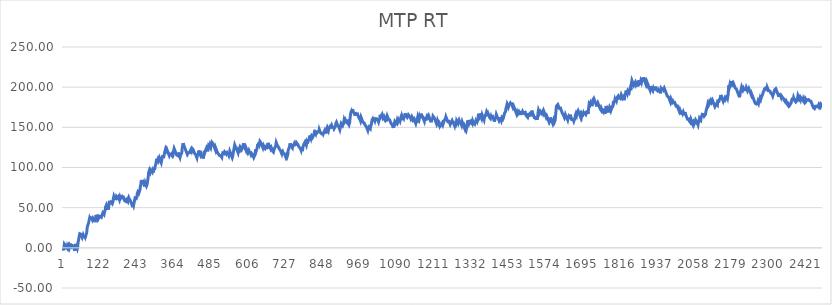
| Category | MTP RT |
|---|---|
| 0 | -1 |
| 1 | -2 |
| 2 | -3 |
| 3 | 0.92 |
| 4 | 4.74 |
| 5 | 5.69 |
| 6 | 4.69 |
| 7 | 3.69 |
| 8 | 2.69 |
| 9 | 1.69 |
| 10 | 0.69 |
| 11 | -0.31 |
| 12 | 0.31 |
| 13 | -0.69 |
| 14 | 1.71 |
| 15 | 0.71 |
| 16 | -0.29 |
| 17 | -1.29 |
| 18 | 2.24 |
| 19 | 1.24 |
| 20 | 0.24 |
| 21 | -0.76 |
| 22 | 3.65 |
| 23 | 2.65 |
| 24 | 3.55 |
| 25 | 2.55 |
| 26 | 1.55 |
| 27 | 0.55 |
| 28 | 3.29 |
| 29 | 2.29 |
| 30 | 4.3 |
| 31 | 3.3 |
| 32 | 2.3 |
| 33 | 1.3 |
| 34 | 0.3 |
| 35 | -0.7 |
| 36 | -1.7 |
| 37 | -2.7 |
| 38 | -3.7 |
| 39 | 0.12 |
| 40 | 4.92 |
| 41 | 3.92 |
| 42 | 2.92 |
| 43 | 1.92 |
| 44 | 0.92 |
| 45 | -0.08 |
| 46 | -1.08 |
| 47 | 0.636 |
| 48 | 5.046 |
| 49 | 7.786 |
| 50 | 9.316 |
| 51 | 11.866 |
| 52 | 10.866 |
| 53 | 15.766 |
| 54 | 17.566 |
| 55 | 16.566 |
| 56 | 17.496 |
| 57 | 17.906 |
| 58 | 16.906 |
| 59 | 15.906 |
| 60 | 14.906 |
| 61 | 13.906 |
| 62 | 12.906 |
| 63 | 14.006 |
| 64 | 13.006 |
| 65 | 16.146 |
| 66 | 15.146 |
| 67 | 14.146 |
| 68 | 13.146 |
| 69 | 12.146 |
| 70 | 15.186 |
| 71 | 14.186 |
| 72 | 13.186 |
| 73 | 12.186 |
| 74 | 15.616 |
| 75 | 14.616 |
| 76 | 15.436 |
| 77 | 19.846 |
| 78 | 24.456 |
| 79 | 26.516 |
| 80 | 25.516 |
| 81 | 27.626 |
| 82 | 26.626 |
| 83 | 31.526 |
| 84 | 30.526 |
| 85 | 31.436 |
| 86 | 36.726 |
| 87 | 35.726 |
| 88 | 34.726 |
| 89 | 37.666 |
| 90 | 38.546 |
| 91 | 37.546 |
| 92 | 36.546 |
| 93 | 37.116 |
| 94 | 36.116 |
| 95 | 35.116 |
| 96 | 34.116 |
| 97 | 37.256 |
| 98 | 37.976 |
| 99 | 36.976 |
| 100 | 35.976 |
| 101 | 34.976 |
| 102 | 33.976 |
| 103 | 32.976 |
| 104 | 31.976 |
| 105 | 35.306 |
| 106 | 36.136 |
| 107 | 41.036 |
| 108 | 40.036 |
| 109 | 39.036 |
| 110 | 38.036 |
| 111 | 37.036 |
| 112 | 36.036 |
| 113 | 35.036 |
| 114 | 34.036 |
| 115 | 36.586 |
| 116 | 39.626 |
| 117 | 38.626 |
| 118 | 39.156 |
| 119 | 40.056 |
| 120 | 39.056 |
| 121 | 38.056 |
| 122 | 39.976 |
| 123 | 38.976 |
| 124 | 37.976 |
| 125 | 38.876 |
| 126 | 40.596 |
| 127 | 41.086 |
| 128 | 41.596 |
| 129 | 43.536 |
| 130 | 42.536 |
| 131 | 43.476 |
| 132 | 42.476 |
| 133 | 41.476 |
| 134 | 42.026 |
| 135 | 45.356 |
| 136 | 44.356 |
| 137 | 47.196 |
| 138 | 50.826 |
| 139 | 51.946 |
| 140 | 50.946 |
| 141 | 53.596 |
| 142 | 52.596 |
| 143 | 51.596 |
| 144 | 50.596 |
| 145 | 49.596 |
| 146 | 48.596 |
| 147 | 47.596 |
| 148 | 50.246 |
| 149 | 53.186 |
| 150 | 56.516 |
| 151 | 57.376 |
| 152 | 56.376 |
| 153 | 55.376 |
| 154 | 55.956 |
| 155 | 58.796 |
| 156 | 57.796 |
| 157 | 56.796 |
| 158 | 57.116 |
| 159 | 56.116 |
| 160 | 55.116 |
| 161 | 54.116 |
| 162 | 57.346 |
| 163 | 60.486 |
| 164 | 59.486 |
| 165 | 64.186 |
| 166 | 63.186 |
| 167 | 62.186 |
| 168 | 62.566 |
| 169 | 61.566 |
| 170 | 62.276 |
| 171 | 61.276 |
| 172 | 60.276 |
| 173 | 63.996 |
| 174 | 64.296 |
| 175 | 63.296 |
| 176 | 62.296 |
| 177 | 62.656 |
| 178 | 61.656 |
| 179 | 63.716 |
| 180 | 62.716 |
| 181 | 61.716 |
| 182 | 60.716 |
| 183 | 59.716 |
| 184 | 58.716 |
| 185 | 63.226 |
| 186 | 62.226 |
| 187 | 61.226 |
| 188 | 60.226 |
| 189 | 62.426 |
| 190 | 61.426 |
| 191 | 63.386 |
| 192 | 62.386 |
| 193 | 61.386 |
| 194 | 64.616 |
| 195 | 63.616 |
| 196 | 62.616 |
| 197 | 61.616 |
| 198 | 60.616 |
| 199 | 59.616 |
| 200 | 58.616 |
| 201 | 57.616 |
| 202 | 59.726 |
| 203 | 58.726 |
| 204 | 57.726 |
| 205 | 56.726 |
| 206 | 59.766 |
| 207 | 60.656 |
| 208 | 59.656 |
| 209 | 58.656 |
| 210 | 57.656 |
| 211 | 60.886 |
| 212 | 61.716 |
| 213 | 62.756 |
| 214 | 61.756 |
| 215 | 60.756 |
| 216 | 59.756 |
| 217 | 60.256 |
| 218 | 59.256 |
| 219 | 58.256 |
| 220 | 57.256 |
| 221 | 56.256 |
| 222 | 55.256 |
| 223 | 54.256 |
| 224 | 53.256 |
| 225 | 52.256 |
| 226 | 54.266 |
| 227 | 54.656 |
| 228 | 53.656 |
| 229 | 52.656 |
| 230 | 51.656 |
| 231 | 56.756 |
| 232 | 58.616 |
| 233 | 57.616 |
| 234 | 62.126 |
| 235 | 61.126 |
| 236 | 61.586 |
| 237 | 62.426 |
| 238 | 61.426 |
| 239 | 60.426 |
| 240 | 63.466 |
| 241 | 67.676 |
| 242 | 66.676 |
| 243 | 69.616 |
| 244 | 69.856 |
| 245 | 68.856 |
| 246 | 67.856 |
| 247 | 66.856 |
| 248 | 67.816 |
| 249 | 66.816 |
| 250 | 72.496 |
| 251 | 75.826 |
| 252 | 76.706 |
| 253 | 79.596 |
| 254 | 83.806 |
| 255 | 82.806 |
| 256 | 81.806 |
| 257 | 84.456 |
| 258 | 83.456 |
| 259 | 82.456 |
| 260 | 81.456 |
| 261 | 80.456 |
| 262 | 79.456 |
| 263 | 78.456 |
| 264 | 77.456 |
| 265 | 76.456 |
| 266 | 78.956 |
| 267 | 81.016 |
| 268 | 80.016 |
| 269 | 79.016 |
| 270 | 78.016 |
| 271 | 77.016 |
| 272 | 76.016 |
| 273 | 79.056 |
| 274 | 81.256 |
| 275 | 83.996 |
| 276 | 86.646 |
| 277 | 89.096 |
| 278 | 93.796 |
| 279 | 94.506 |
| 280 | 93.506 |
| 281 | 97.136 |
| 282 | 96.136 |
| 283 | 95.136 |
| 284 | 97.296 |
| 285 | 97.936 |
| 286 | 96.936 |
| 287 | 95.936 |
| 288 | 94.936 |
| 289 | 95.226 |
| 290 | 94.226 |
| 291 | 95.876 |
| 292 | 94.876 |
| 293 | 93.876 |
| 294 | 94.286 |
| 295 | 98.896 |
| 296 | 97.896 |
| 297 | 96.896 |
| 298 | 99.736 |
| 299 | 98.736 |
| 300 | 102.456 |
| 301 | 101.456 |
| 302 | 105.476 |
| 303 | 104.476 |
| 304 | 110.746 |
| 305 | 109.746 |
| 306 | 108.746 |
| 307 | 107.746 |
| 308 | 110.536 |
| 309 | 109.536 |
| 310 | 108.536 |
| 311 | 107.536 |
| 312 | 108.486 |
| 313 | 112.116 |
| 314 | 111.116 |
| 315 | 110.116 |
| 316 | 109.116 |
| 317 | 108.116 |
| 318 | 107.116 |
| 319 | 106.116 |
| 320 | 106.576 |
| 321 | 110.296 |
| 322 | 111.316 |
| 323 | 113.616 |
| 324 | 112.616 |
| 325 | 113.676 |
| 326 | 112.676 |
| 327 | 113.316 |
| 328 | 112.316 |
| 329 | 116.436 |
| 330 | 118.736 |
| 331 | 118.906 |
| 332 | 117.906 |
| 333 | 123.006 |
| 334 | 122.006 |
| 335 | 121.006 |
| 336 | 120.006 |
| 337 | 122.896 |
| 338 | 121.896 |
| 339 | 120.896 |
| 340 | 119.896 |
| 341 | 118.896 |
| 342 | 117.896 |
| 343 | 116.896 |
| 344 | 115.896 |
| 345 | 114.896 |
| 346 | 113.896 |
| 347 | 116.936 |
| 348 | 115.936 |
| 349 | 116.606 |
| 350 | 117.286 |
| 351 | 116.286 |
| 352 | 115.286 |
| 353 | 115.856 |
| 354 | 114.856 |
| 355 | 113.856 |
| 356 | 119.736 |
| 357 | 118.736 |
| 358 | 117.736 |
| 359 | 120.136 |
| 360 | 119.136 |
| 361 | 123.646 |
| 362 | 122.646 |
| 363 | 121.646 |
| 364 | 120.646 |
| 365 | 119.646 |
| 366 | 118.646 |
| 367 | 117.646 |
| 368 | 116.646 |
| 369 | 115.646 |
| 370 | 114.646 |
| 371 | 116.806 |
| 372 | 115.806 |
| 373 | 114.806 |
| 374 | 118.526 |
| 375 | 117.526 |
| 376 | 116.526 |
| 377 | 115.526 |
| 378 | 114.526 |
| 379 | 113.526 |
| 380 | 112.526 |
| 381 | 114.366 |
| 382 | 113.366 |
| 383 | 115.866 |
| 384 | 116.366 |
| 385 | 115.366 |
| 386 | 118.596 |
| 387 | 123.496 |
| 388 | 122.496 |
| 389 | 127.396 |
| 390 | 130.186 |
| 391 | 129.186 |
| 392 | 128.186 |
| 393 | 127.186 |
| 394 | 126.186 |
| 395 | 125.186 |
| 396 | 124.186 |
| 397 | 123.186 |
| 398 | 122.186 |
| 399 | 121.186 |
| 400 | 120.186 |
| 401 | 119.186 |
| 402 | 118.186 |
| 403 | 117.186 |
| 404 | 116.186 |
| 405 | 116.586 |
| 406 | 115.586 |
| 407 | 118.236 |
| 408 | 118.486 |
| 409 | 119.176 |
| 410 | 118.176 |
| 411 | 119.016 |
| 412 | 118.016 |
| 413 | 117.016 |
| 414 | 121.136 |
| 415 | 120.136 |
| 416 | 122.686 |
| 417 | 121.686 |
| 418 | 120.686 |
| 419 | 119.686 |
| 420 | 123.506 |
| 421 | 124.056 |
| 422 | 123.056 |
| 423 | 122.056 |
| 424 | 121.056 |
| 425 | 120.056 |
| 426 | 119.056 |
| 427 | 118.056 |
| 428 | 117.056 |
| 429 | 118.016 |
| 430 | 117.016 |
| 431 | 116.016 |
| 432 | 115.016 |
| 433 | 114.016 |
| 434 | 113.016 |
| 435 | 112.016 |
| 436 | 114.126 |
| 437 | 116.816 |
| 438 | 115.816 |
| 439 | 114.816 |
| 440 | 118.636 |
| 441 | 121.086 |
| 442 | 120.086 |
| 443 | 119.086 |
| 444 | 118.086 |
| 445 | 117.086 |
| 446 | 116.086 |
| 447 | 115.086 |
| 448 | 114.086 |
| 449 | 116.876 |
| 450 | 115.876 |
| 451 | 114.876 |
| 452 | 115.276 |
| 453 | 114.276 |
| 454 | 113.276 |
| 455 | 112.276 |
| 456 | 111.276 |
| 457 | 114.506 |
| 458 | 117.196 |
| 459 | 120.826 |
| 460 | 119.826 |
| 461 | 118.826 |
| 462 | 119.636 |
| 463 | 118.636 |
| 464 | 122.066 |
| 465 | 121.066 |
| 466 | 124.106 |
| 467 | 123.106 |
| 468 | 122.106 |
| 469 | 121.106 |
| 470 | 120.106 |
| 471 | 123.636 |
| 472 | 122.636 |
| 473 | 127.436 |
| 474 | 128.296 |
| 475 | 127.296 |
| 476 | 126.296 |
| 477 | 125.296 |
| 478 | 127.496 |
| 479 | 126.496 |
| 480 | 125.496 |
| 481 | 127.896 |
| 482 | 126.896 |
| 483 | 129.396 |
| 484 | 131.406 |
| 485 | 132.056 |
| 486 | 131.056 |
| 487 | 130.056 |
| 488 | 129.056 |
| 489 | 128.056 |
| 490 | 127.056 |
| 491 | 126.056 |
| 492 | 125.056 |
| 493 | 124.056 |
| 494 | 123.056 |
| 495 | 122.056 |
| 496 | 124.456 |
| 497 | 123.456 |
| 498 | 122.456 |
| 499 | 121.456 |
| 500 | 120.456 |
| 501 | 119.456 |
| 502 | 118.456 |
| 503 | 118.876 |
| 504 | 117.876 |
| 505 | 116.876 |
| 506 | 117.796 |
| 507 | 116.796 |
| 508 | 115.796 |
| 509 | 114.796 |
| 510 | 113.796 |
| 511 | 114.296 |
| 512 | 115.266 |
| 513 | 114.266 |
| 514 | 113.266 |
| 515 | 113.576 |
| 516 | 112.576 |
| 517 | 115.266 |
| 518 | 116.406 |
| 519 | 118.126 |
| 520 | 117.126 |
| 521 | 119.286 |
| 522 | 118.286 |
| 523 | 117.286 |
| 524 | 116.286 |
| 525 | 119.426 |
| 526 | 118.426 |
| 527 | 119.426 |
| 528 | 118.426 |
| 529 | 117.426 |
| 530 | 120.566 |
| 531 | 119.566 |
| 532 | 118.566 |
| 533 | 117.566 |
| 534 | 116.566 |
| 535 | 119.016 |
| 536 | 118.016 |
| 537 | 117.016 |
| 538 | 116.016 |
| 539 | 115.016 |
| 540 | 114.016 |
| 541 | 117.936 |
| 542 | 120.186 |
| 543 | 119.186 |
| 544 | 118.186 |
| 545 | 117.186 |
| 546 | 116.186 |
| 547 | 115.186 |
| 548 | 114.186 |
| 549 | 113.186 |
| 550 | 112.186 |
| 551 | 112.706 |
| 552 | 114.816 |
| 553 | 118.046 |
| 554 | 117.046 |
| 555 | 121.656 |
| 556 | 124.206 |
| 557 | 123.206 |
| 558 | 128.106 |
| 559 | 127.106 |
| 560 | 126.106 |
| 561 | 125.106 |
| 562 | 124.106 |
| 563 | 123.106 |
| 564 | 123.476 |
| 565 | 122.476 |
| 566 | 121.476 |
| 567 | 120.476 |
| 568 | 119.476 |
| 569 | 118.476 |
| 570 | 120.586 |
| 571 | 119.586 |
| 572 | 118.586 |
| 573 | 122.606 |
| 574 | 121.606 |
| 575 | 124.056 |
| 576 | 125.916 |
| 577 | 126.556 |
| 578 | 125.556 |
| 579 | 124.556 |
| 580 | 123.556 |
| 581 | 122.556 |
| 582 | 121.556 |
| 583 | 124.006 |
| 584 | 123.006 |
| 585 | 125.696 |
| 586 | 130.106 |
| 587 | 129.106 |
| 588 | 128.106 |
| 589 | 127.106 |
| 590 | 126.106 |
| 591 | 125.106 |
| 592 | 124.106 |
| 593 | 123.106 |
| 594 | 122.106 |
| 595 | 124.306 |
| 596 | 123.306 |
| 597 | 122.306 |
| 598 | 121.306 |
| 599 | 120.306 |
| 600 | 119.306 |
| 601 | 118.306 |
| 602 | 118.786 |
| 603 | 117.786 |
| 604 | 121.216 |
| 605 | 120.216 |
| 606 | 119.216 |
| 607 | 118.216 |
| 608 | 118.876 |
| 609 | 117.876 |
| 610 | 116.876 |
| 611 | 115.876 |
| 612 | 116.726 |
| 613 | 117.696 |
| 614 | 118.436 |
| 615 | 117.436 |
| 616 | 116.436 |
| 617 | 115.436 |
| 618 | 114.436 |
| 619 | 113.436 |
| 620 | 112.436 |
| 621 | 112.676 |
| 622 | 113.196 |
| 623 | 113.546 |
| 624 | 115.896 |
| 625 | 119.126 |
| 626 | 122.556 |
| 627 | 121.556 |
| 628 | 120.556 |
| 629 | 119.556 |
| 630 | 122.886 |
| 631 | 121.886 |
| 632 | 126.296 |
| 633 | 129.236 |
| 634 | 128.236 |
| 635 | 127.236 |
| 636 | 130.866 |
| 637 | 129.866 |
| 638 | 128.866 |
| 639 | 127.866 |
| 640 | 132.566 |
| 641 | 133.366 |
| 642 | 132.366 |
| 643 | 131.366 |
| 644 | 130.366 |
| 645 | 129.366 |
| 646 | 128.366 |
| 647 | 127.366 |
| 648 | 126.366 |
| 649 | 125.366 |
| 650 | 124.366 |
| 651 | 123.366 |
| 652 | 126.796 |
| 653 | 125.796 |
| 654 | 124.796 |
| 655 | 125.466 |
| 656 | 124.466 |
| 657 | 123.466 |
| 658 | 122.466 |
| 659 | 124.966 |
| 660 | 123.966 |
| 661 | 122.966 |
| 662 | 125.466 |
| 663 | 124.466 |
| 664 | 123.466 |
| 665 | 126.796 |
| 666 | 130.616 |
| 667 | 129.616 |
| 668 | 128.616 |
| 669 | 127.616 |
| 670 | 128.066 |
| 671 | 127.066 |
| 672 | 126.066 |
| 673 | 125.066 |
| 674 | 124.066 |
| 675 | 123.066 |
| 676 | 122.066 |
| 677 | 124.756 |
| 678 | 123.756 |
| 679 | 122.756 |
| 680 | 121.756 |
| 681 | 120.756 |
| 682 | 121.286 |
| 683 | 120.286 |
| 684 | 119.286 |
| 685 | 119.916 |
| 686 | 122.216 |
| 687 | 121.216 |
| 688 | 124.356 |
| 689 | 123.356 |
| 690 | 125.556 |
| 691 | 126.346 |
| 692 | 126.726 |
| 693 | 131.136 |
| 694 | 130.136 |
| 695 | 129.136 |
| 696 | 128.136 |
| 697 | 127.136 |
| 698 | 128.116 |
| 699 | 127.116 |
| 700 | 126.116 |
| 701 | 125.116 |
| 702 | 124.116 |
| 703 | 123.116 |
| 704 | 122.116 |
| 705 | 123.086 |
| 706 | 122.086 |
| 707 | 121.086 |
| 708 | 120.086 |
| 709 | 119.086 |
| 710 | 118.086 |
| 711 | 117.086 |
| 712 | 118.656 |
| 713 | 117.656 |
| 714 | 119.906 |
| 715 | 118.906 |
| 716 | 117.906 |
| 717 | 118.376 |
| 718 | 117.376 |
| 719 | 117.896 |
| 720 | 116.896 |
| 721 | 115.896 |
| 722 | 114.896 |
| 723 | 113.896 |
| 724 | 112.896 |
| 725 | 111.896 |
| 726 | 114.836 |
| 727 | 113.836 |
| 728 | 112.836 |
| 729 | 111.836 |
| 730 | 115.066 |
| 731 | 117.516 |
| 732 | 121.536 |
| 733 | 120.536 |
| 734 | 123.476 |
| 735 | 122.476 |
| 736 | 122.826 |
| 737 | 127.236 |
| 738 | 130.076 |
| 739 | 129.076 |
| 740 | 128.076 |
| 741 | 127.076 |
| 742 | 126.076 |
| 743 | 126.596 |
| 744 | 125.596 |
| 745 | 124.596 |
| 746 | 128.716 |
| 747 | 127.716 |
| 748 | 126.716 |
| 749 | 125.716 |
| 750 | 126.916 |
| 751 | 129.166 |
| 752 | 128.166 |
| 753 | 130.906 |
| 754 | 131.816 |
| 755 | 130.816 |
| 756 | 129.816 |
| 757 | 128.816 |
| 758 | 127.816 |
| 759 | 126.816 |
| 760 | 130.346 |
| 761 | 131.276 |
| 762 | 130.276 |
| 763 | 129.276 |
| 764 | 128.276 |
| 765 | 127.276 |
| 766 | 126.276 |
| 767 | 125.276 |
| 768 | 125.866 |
| 769 | 124.866 |
| 770 | 125.366 |
| 771 | 124.366 |
| 772 | 123.366 |
| 773 | 122.366 |
| 774 | 121.366 |
| 775 | 123.376 |
| 776 | 122.376 |
| 777 | 124.576 |
| 778 | 123.576 |
| 779 | 122.576 |
| 780 | 125.516 |
| 781 | 125.886 |
| 782 | 124.886 |
| 783 | 129.006 |
| 784 | 130.026 |
| 785 | 130.316 |
| 786 | 131.096 |
| 787 | 131.806 |
| 788 | 130.806 |
| 789 | 129.806 |
| 790 | 128.806 |
| 791 | 127.806 |
| 792 | 126.806 |
| 793 | 131.706 |
| 794 | 130.706 |
| 795 | 129.706 |
| 796 | 133.726 |
| 797 | 132.726 |
| 798 | 133.646 |
| 799 | 132.646 |
| 800 | 134.526 |
| 801 | 135.586 |
| 802 | 139.796 |
| 803 | 138.796 |
| 804 | 137.796 |
| 805 | 136.796 |
| 806 | 135.796 |
| 807 | 134.796 |
| 808 | 139.006 |
| 809 | 139.186 |
| 810 | 138.186 |
| 811 | 137.186 |
| 812 | 136.186 |
| 813 | 138.536 |
| 814 | 137.536 |
| 815 | 140.576 |
| 816 | 139.576 |
| 817 | 143.696 |
| 818 | 144.506 |
| 819 | 143.506 |
| 820 | 142.506 |
| 821 | 141.506 |
| 822 | 144.396 |
| 823 | 144.616 |
| 824 | 145.276 |
| 825 | 144.276 |
| 826 | 143.276 |
| 827 | 142.276 |
| 828 | 144.676 |
| 829 | 145.006 |
| 830 | 144.006 |
| 831 | 144.496 |
| 832 | 145.136 |
| 833 | 147.386 |
| 834 | 146.386 |
| 835 | 145.386 |
| 836 | 144.386 |
| 837 | 143.386 |
| 838 | 142.386 |
| 839 | 144.346 |
| 840 | 143.346 |
| 841 | 142.346 |
| 842 | 141.346 |
| 843 | 140.346 |
| 844 | 143.776 |
| 845 | 142.776 |
| 846 | 141.776 |
| 847 | 142.566 |
| 848 | 141.566 |
| 849 | 144.796 |
| 850 | 143.796 |
| 851 | 146.346 |
| 852 | 145.346 |
| 853 | 144.346 |
| 854 | 143.346 |
| 855 | 142.346 |
| 856 | 145.386 |
| 857 | 148.226 |
| 858 | 147.226 |
| 859 | 150.066 |
| 860 | 149.066 |
| 861 | 148.066 |
| 862 | 147.066 |
| 863 | 146.066 |
| 864 | 147.906 |
| 865 | 146.906 |
| 866 | 149.106 |
| 867 | 148.106 |
| 868 | 150.556 |
| 869 | 149.556 |
| 870 | 148.556 |
| 871 | 151.156 |
| 872 | 152.056 |
| 873 | 152.826 |
| 874 | 151.826 |
| 875 | 150.826 |
| 876 | 151.736 |
| 877 | 150.736 |
| 878 | 151.076 |
| 879 | 150.076 |
| 880 | 149.076 |
| 881 | 148.076 |
| 882 | 147.076 |
| 883 | 147.706 |
| 884 | 150.106 |
| 885 | 149.106 |
| 886 | 151.706 |
| 887 | 154.936 |
| 888 | 153.936 |
| 889 | 156.486 |
| 890 | 155.486 |
| 891 | 154.486 |
| 892 | 153.486 |
| 893 | 152.486 |
| 894 | 152.976 |
| 895 | 151.976 |
| 896 | 150.976 |
| 897 | 149.976 |
| 898 | 148.976 |
| 899 | 147.976 |
| 900 | 146.976 |
| 901 | 145.976 |
| 902 | 146.896 |
| 903 | 152.386 |
| 904 | 151.386 |
| 905 | 150.386 |
| 906 | 153.816 |
| 907 | 154.116 |
| 908 | 153.116 |
| 909 | 152.116 |
| 910 | 151.116 |
| 911 | 153.276 |
| 912 | 155.526 |
| 913 | 157.386 |
| 914 | 159.586 |
| 915 | 158.586 |
| 916 | 157.586 |
| 917 | 156.586 |
| 918 | 159.236 |
| 919 | 158.236 |
| 920 | 157.236 |
| 921 | 156.236 |
| 922 | 156.976 |
| 923 | 155.976 |
| 924 | 159.506 |
| 925 | 158.506 |
| 926 | 157.506 |
| 927 | 156.506 |
| 928 | 155.506 |
| 929 | 154.506 |
| 930 | 153.506 |
| 931 | 154.256 |
| 932 | 156.096 |
| 933 | 160.896 |
| 934 | 163.936 |
| 935 | 166.336 |
| 936 | 168.836 |
| 937 | 167.836 |
| 938 | 170.486 |
| 939 | 169.486 |
| 940 | 168.486 |
| 941 | 172.406 |
| 942 | 171.406 |
| 943 | 170.406 |
| 944 | 169.406 |
| 945 | 168.406 |
| 946 | 168.596 |
| 947 | 167.596 |
| 948 | 166.596 |
| 949 | 165.596 |
| 950 | 164.596 |
| 951 | 168.716 |
| 952 | 167.716 |
| 953 | 166.716 |
| 954 | 165.716 |
| 955 | 164.716 |
| 956 | 167.856 |
| 957 | 166.856 |
| 958 | 165.856 |
| 959 | 164.856 |
| 960 | 163.856 |
| 961 | 162.856 |
| 962 | 161.856 |
| 963 | 162.096 |
| 964 | 161.096 |
| 965 | 160.096 |
| 966 | 159.096 |
| 967 | 158.096 |
| 968 | 160.256 |
| 969 | 162.456 |
| 970 | 161.456 |
| 971 | 160.456 |
| 972 | 159.456 |
| 973 | 158.456 |
| 974 | 157.456 |
| 975 | 156.456 |
| 976 | 155.456 |
| 977 | 157.516 |
| 978 | 156.516 |
| 979 | 155.516 |
| 980 | 154.516 |
| 981 | 153.516 |
| 982 | 152.516 |
| 983 | 152.906 |
| 984 | 151.906 |
| 985 | 150.906 |
| 986 | 151.056 |
| 987 | 150.056 |
| 988 | 149.056 |
| 989 | 148.056 |
| 990 | 147.056 |
| 991 | 146.056 |
| 992 | 146.386 |
| 993 | 149.276 |
| 994 | 150.376 |
| 995 | 150.636 |
| 996 | 151.576 |
| 997 | 150.576 |
| 998 | 149.576 |
| 999 | 148.576 |
| 1000 | 151.516 |
| 1001 | 150.516 |
| 1002 | 152.916 |
| 1003 | 151.916 |
| 1004 | 152.826 |
| 1005 | 159.486 |
| 1006 | 158.486 |
| 1007 | 160.736 |
| 1008 | 159.736 |
| 1009 | 158.736 |
| 1010 | 157.736 |
| 1011 | 156.736 |
| 1012 | 160.066 |
| 1013 | 159.066 |
| 1014 | 158.066 |
| 1015 | 157.066 |
| 1016 | 160.986 |
| 1017 | 159.986 |
| 1018 | 160.596 |
| 1019 | 161.636 |
| 1020 | 160.636 |
| 1021 | 161.616 |
| 1022 | 160.616 |
| 1023 | 159.616 |
| 1024 | 158.616 |
| 1025 | 157.616 |
| 1026 | 156.616 |
| 1027 | 155.616 |
| 1028 | 159.336 |
| 1029 | 158.336 |
| 1030 | 161.126 |
| 1031 | 165.536 |
| 1032 | 164.536 |
| 1033 | 163.536 |
| 1034 | 164.056 |
| 1035 | 163.056 |
| 1036 | 165.356 |
| 1037 | 164.356 |
| 1038 | 163.356 |
| 1039 | 165.046 |
| 1040 | 164.046 |
| 1041 | 163.046 |
| 1042 | 162.046 |
| 1043 | 161.046 |
| 1044 | 160.046 |
| 1045 | 160.356 |
| 1046 | 159.356 |
| 1047 | 161.316 |
| 1048 | 160.316 |
| 1049 | 159.316 |
| 1050 | 158.316 |
| 1051 | 157.316 |
| 1052 | 160.646 |
| 1053 | 161.266 |
| 1054 | 164.106 |
| 1055 | 163.106 |
| 1056 | 162.106 |
| 1057 | 161.106 |
| 1058 | 160.106 |
| 1059 | 159.106 |
| 1060 | 161.306 |
| 1061 | 160.306 |
| 1062 | 159.306 |
| 1063 | 158.306 |
| 1064 | 157.306 |
| 1065 | 156.306 |
| 1066 | 155.306 |
| 1067 | 154.306 |
| 1068 | 155.246 |
| 1069 | 154.246 |
| 1070 | 153.246 |
| 1071 | 152.246 |
| 1072 | 151.246 |
| 1073 | 150.246 |
| 1074 | 149.246 |
| 1075 | 153.066 |
| 1076 | 153.936 |
| 1077 | 152.936 |
| 1078 | 156.566 |
| 1079 | 155.566 |
| 1080 | 154.566 |
| 1081 | 153.566 |
| 1082 | 156.356 |
| 1083 | 155.356 |
| 1084 | 155.996 |
| 1085 | 154.996 |
| 1086 | 153.996 |
| 1087 | 158.896 |
| 1088 | 157.896 |
| 1089 | 156.896 |
| 1090 | 155.896 |
| 1091 | 159.036 |
| 1092 | 158.036 |
| 1093 | 157.036 |
| 1094 | 159.976 |
| 1095 | 158.976 |
| 1096 | 157.976 |
| 1097 | 156.976 |
| 1098 | 161.096 |
| 1099 | 160.096 |
| 1100 | 159.096 |
| 1101 | 161.886 |
| 1102 | 164.186 |
| 1103 | 163.186 |
| 1104 | 162.186 |
| 1105 | 162.776 |
| 1106 | 161.776 |
| 1107 | 160.776 |
| 1108 | 163.816 |
| 1109 | 162.816 |
| 1110 | 161.816 |
| 1111 | 164.316 |
| 1112 | 167.456 |
| 1113 | 166.456 |
| 1114 | 165.456 |
| 1115 | 164.456 |
| 1116 | 163.456 |
| 1117 | 164.196 |
| 1118 | 163.196 |
| 1119 | 162.196 |
| 1120 | 161.196 |
| 1121 | 163.446 |
| 1122 | 162.446 |
| 1123 | 165.486 |
| 1124 | 164.486 |
| 1125 | 164.936 |
| 1126 | 163.936 |
| 1127 | 162.936 |
| 1128 | 163.496 |
| 1129 | 162.496 |
| 1130 | 161.496 |
| 1131 | 160.496 |
| 1132 | 159.496 |
| 1133 | 160.146 |
| 1134 | 163.086 |
| 1135 | 162.086 |
| 1136 | 161.086 |
| 1137 | 160.086 |
| 1138 | 159.086 |
| 1139 | 159.546 |
| 1140 | 158.546 |
| 1141 | 160.706 |
| 1142 | 159.706 |
| 1143 | 158.706 |
| 1144 | 157.706 |
| 1145 | 156.706 |
| 1146 | 155.706 |
| 1147 | 154.706 |
| 1148 | 153.706 |
| 1149 | 157.626 |
| 1150 | 156.626 |
| 1151 | 155.626 |
| 1152 | 158.856 |
| 1153 | 162.086 |
| 1154 | 164.006 |
| 1155 | 163.006 |
| 1156 | 162.006 |
| 1157 | 161.006 |
| 1158 | 160.006 |
| 1159 | 159.006 |
| 1160 | 163.516 |
| 1161 | 162.516 |
| 1162 | 161.516 |
| 1163 | 164.306 |
| 1164 | 166.906 |
| 1165 | 165.906 |
| 1166 | 164.906 |
| 1167 | 165.416 |
| 1168 | 164.416 |
| 1169 | 163.416 |
| 1170 | 162.416 |
| 1171 | 161.416 |
| 1172 | 160.416 |
| 1173 | 159.416 |
| 1174 | 158.416 |
| 1175 | 157.416 |
| 1176 | 158.266 |
| 1177 | 161.006 |
| 1178 | 160.006 |
| 1179 | 160.816 |
| 1180 | 161.256 |
| 1181 | 160.256 |
| 1182 | 162.116 |
| 1183 | 161.116 |
| 1184 | 164.156 |
| 1185 | 164.406 |
| 1186 | 163.406 |
| 1187 | 162.406 |
| 1188 | 161.406 |
| 1189 | 164.346 |
| 1190 | 163.346 |
| 1191 | 162.346 |
| 1192 | 161.346 |
| 1193 | 160.346 |
| 1194 | 159.346 |
| 1195 | 158.346 |
| 1196 | 157.346 |
| 1197 | 156.346 |
| 1198 | 160.166 |
| 1199 | 160.366 |
| 1200 | 159.366 |
| 1201 | 160.366 |
| 1202 | 160.966 |
| 1203 | 163.906 |
| 1204 | 162.906 |
| 1205 | 163.796 |
| 1206 | 162.796 |
| 1207 | 161.796 |
| 1208 | 160.796 |
| 1209 | 159.796 |
| 1210 | 158.796 |
| 1211 | 157.796 |
| 1212 | 156.796 |
| 1213 | 155.796 |
| 1214 | 154.796 |
| 1215 | 153.796 |
| 1216 | 152.796 |
| 1217 | 155.836 |
| 1218 | 158.236 |
| 1219 | 157.236 |
| 1220 | 156.236 |
| 1221 | 155.236 |
| 1222 | 154.236 |
| 1223 | 153.236 |
| 1224 | 152.236 |
| 1225 | 153.726 |
| 1226 | 152.726 |
| 1227 | 151.726 |
| 1228 | 150.726 |
| 1229 | 151.766 |
| 1230 | 150.766 |
| 1231 | 153.506 |
| 1232 | 152.506 |
| 1233 | 155.106 |
| 1234 | 154.106 |
| 1235 | 153.106 |
| 1236 | 154.333 |
| 1237 | 153.333 |
| 1238 | 156.863 |
| 1239 | 155.863 |
| 1240 | 158.903 |
| 1241 | 159.123 |
| 1242 | 159.363 |
| 1243 | 158.363 |
| 1244 | 161.303 |
| 1245 | 163.083 |
| 1246 | 162.083 |
| 1247 | 161.083 |
| 1248 | 160.083 |
| 1249 | 159.083 |
| 1250 | 158.083 |
| 1251 | 157.083 |
| 1252 | 156.083 |
| 1253 | 158.193 |
| 1254 | 157.193 |
| 1255 | 157.463 |
| 1256 | 156.463 |
| 1257 | 155.463 |
| 1258 | 154.463 |
| 1259 | 153.463 |
| 1260 | 152.463 |
| 1261 | 153.283 |
| 1262 | 155.833 |
| 1263 | 154.833 |
| 1264 | 155.603 |
| 1265 | 158.343 |
| 1266 | 157.343 |
| 1267 | 156.343 |
| 1268 | 155.343 |
| 1269 | 156.103 |
| 1270 | 155.103 |
| 1271 | 154.103 |
| 1272 | 153.103 |
| 1273 | 152.103 |
| 1274 | 154.353 |
| 1275 | 153.353 |
| 1276 | 153.923 |
| 1277 | 152.923 |
| 1278 | 151.923 |
| 1279 | 155.553 |
| 1280 | 158.883 |
| 1281 | 159.243 |
| 1282 | 158.243 |
| 1283 | 157.243 |
| 1284 | 156.243 |
| 1285 | 155.243 |
| 1286 | 156.133 |
| 1287 | 155.133 |
| 1288 | 158.763 |
| 1289 | 157.763 |
| 1290 | 156.763 |
| 1291 | 157.723 |
| 1292 | 156.723 |
| 1293 | 155.723 |
| 1294 | 154.723 |
| 1295 | 153.723 |
| 1296 | 152.723 |
| 1297 | 153.493 |
| 1298 | 156.723 |
| 1299 | 155.723 |
| 1300 | 154.723 |
| 1301 | 153.723 |
| 1302 | 152.723 |
| 1303 | 151.723 |
| 1304 | 150.723 |
| 1305 | 149.723 |
| 1306 | 148.723 |
| 1307 | 150.733 |
| 1308 | 149.733 |
| 1309 | 148.733 |
| 1310 | 147.733 |
| 1311 | 146.733 |
| 1312 | 148.473 |
| 1313 | 147.473 |
| 1314 | 150.613 |
| 1315 | 154.733 |
| 1316 | 158.653 |
| 1317 | 157.653 |
| 1318 | 156.653 |
| 1319 | 155.653 |
| 1320 | 154.653 |
| 1321 | 153.653 |
| 1322 | 156.693 |
| 1323 | 155.693 |
| 1324 | 157.513 |
| 1325 | 156.513 |
| 1326 | 155.513 |
| 1327 | 159.723 |
| 1328 | 158.723 |
| 1329 | 157.723 |
| 1330 | 156.723 |
| 1331 | 155.723 |
| 1332 | 157.973 |
| 1333 | 156.973 |
| 1334 | 155.973 |
| 1335 | 156.693 |
| 1336 | 155.693 |
| 1337 | 154.693 |
| 1338 | 158.023 |
| 1339 | 157.023 |
| 1340 | 156.023 |
| 1341 | 155.023 |
| 1342 | 158.163 |
| 1343 | 157.163 |
| 1344 | 156.163 |
| 1345 | 159.203 |
| 1346 | 158.203 |
| 1347 | 157.203 |
| 1348 | 156.203 |
| 1349 | 159.343 |
| 1350 | 163.263 |
| 1351 | 163.983 |
| 1352 | 162.983 |
| 1353 | 161.983 |
| 1354 | 164.093 |
| 1355 | 167.233 |
| 1356 | 166.233 |
| 1357 | 165.233 |
| 1358 | 164.233 |
| 1359 | 163.233 |
| 1360 | 162.233 |
| 1361 | 161.233 |
| 1362 | 160.233 |
| 1363 | 165.523 |
| 1364 | 164.523 |
| 1365 | 163.523 |
| 1366 | 162.523 |
| 1367 | 161.523 |
| 1368 | 160.523 |
| 1369 | 159.523 |
| 1370 | 161.923 |
| 1371 | 160.923 |
| 1372 | 161.503 |
| 1373 | 164.643 |
| 1374 | 163.643 |
| 1375 | 165.993 |
| 1376 | 164.993 |
| 1377 | 169.013 |
| 1378 | 168.013 |
| 1379 | 167.013 |
| 1380 | 166.013 |
| 1381 | 168.313 |
| 1382 | 167.313 |
| 1383 | 166.313 |
| 1384 | 165.313 |
| 1385 | 164.313 |
| 1386 | 163.313 |
| 1387 | 162.313 |
| 1388 | 161.313 |
| 1389 | 161.903 |
| 1390 | 160.903 |
| 1391 | 159.903 |
| 1392 | 163.623 |
| 1393 | 162.623 |
| 1394 | 161.623 |
| 1395 | 165.153 |
| 1396 | 164.153 |
| 1397 | 163.153 |
| 1398 | 162.153 |
| 1399 | 161.153 |
| 1400 | 160.153 |
| 1401 | 159.153 |
| 1402 | 158.153 |
| 1403 | 157.153 |
| 1404 | 160.193 |
| 1405 | 159.193 |
| 1406 | 161.933 |
| 1407 | 160.933 |
| 1408 | 163.673 |
| 1409 | 165.873 |
| 1410 | 164.873 |
| 1411 | 163.873 |
| 1412 | 162.873 |
| 1413 | 161.873 |
| 1414 | 162.233 |
| 1415 | 161.233 |
| 1416 | 160.233 |
| 1417 | 159.233 |
| 1418 | 158.233 |
| 1419 | 157.233 |
| 1420 | 159.833 |
| 1421 | 162.433 |
| 1422 | 161.433 |
| 1423 | 160.433 |
| 1424 | 159.433 |
| 1425 | 158.433 |
| 1426 | 159.193 |
| 1427 | 161.793 |
| 1428 | 160.793 |
| 1429 | 161.053 |
| 1430 | 160.053 |
| 1431 | 159.053 |
| 1432 | 161.793 |
| 1433 | 163.463 |
| 1434 | 165.243 |
| 1435 | 164.243 |
| 1436 | 167.873 |
| 1437 | 166.873 |
| 1438 | 167.413 |
| 1439 | 169.613 |
| 1440 | 173.143 |
| 1441 | 172.143 |
| 1442 | 175.673 |
| 1443 | 174.673 |
| 1444 | 178.883 |
| 1445 | 177.883 |
| 1446 | 176.883 |
| 1447 | 175.883 |
| 1448 | 174.883 |
| 1449 | 173.883 |
| 1450 | 175.803 |
| 1451 | 178.103 |
| 1452 | 177.103 |
| 1453 | 177.493 |
| 1454 | 179.893 |
| 1455 | 178.893 |
| 1456 | 177.893 |
| 1457 | 180.733 |
| 1458 | 179.733 |
| 1459 | 178.733 |
| 1460 | 177.733 |
| 1461 | 176.733 |
| 1462 | 175.733 |
| 1463 | 174.733 |
| 1464 | 173.733 |
| 1465 | 176.573 |
| 1466 | 175.573 |
| 1467 | 174.573 |
| 1468 | 173.573 |
| 1469 | 172.573 |
| 1470 | 171.573 |
| 1471 | 170.573 |
| 1472 | 169.573 |
| 1473 | 168.573 |
| 1474 | 167.573 |
| 1475 | 166.573 |
| 1476 | 165.573 |
| 1477 | 169.103 |
| 1478 | 168.103 |
| 1479 | 167.103 |
| 1480 | 167.353 |
| 1481 | 166.353 |
| 1482 | 169.293 |
| 1483 | 168.293 |
| 1484 | 167.293 |
| 1485 | 166.293 |
| 1486 | 165.293 |
| 1487 | 168.433 |
| 1488 | 167.433 |
| 1489 | 169.443 |
| 1490 | 168.443 |
| 1491 | 167.443 |
| 1492 | 167.703 |
| 1493 | 166.703 |
| 1494 | 169.743 |
| 1495 | 168.743 |
| 1496 | 167.743 |
| 1497 | 168.263 |
| 1498 | 167.263 |
| 1499 | 168.053 |
| 1500 | 167.053 |
| 1501 | 170.283 |
| 1502 | 169.283 |
| 1503 | 168.283 |
| 1504 | 167.283 |
| 1505 | 166.283 |
| 1506 | 165.283 |
| 1507 | 164.283 |
| 1508 | 163.283 |
| 1509 | 164.392 |
| 1510 | 163.392 |
| 1511 | 162.392 |
| 1512 | 161.392 |
| 1513 | 164.822 |
| 1514 | 167.562 |
| 1515 | 166.562 |
| 1516 | 165.562 |
| 1517 | 164.562 |
| 1518 | 163.562 |
| 1519 | 166.792 |
| 1520 | 165.792 |
| 1521 | 167.902 |
| 1522 | 166.902 |
| 1523 | 165.902 |
| 1524 | 170.802 |
| 1525 | 169.802 |
| 1526 | 168.802 |
| 1527 | 167.802 |
| 1528 | 166.802 |
| 1529 | 165.802 |
| 1530 | 164.802 |
| 1531 | 163.802 |
| 1532 | 162.802 |
| 1533 | 161.802 |
| 1534 | 160.802 |
| 1535 | 163.252 |
| 1536 | 162.252 |
| 1537 | 161.252 |
| 1538 | 160.252 |
| 1539 | 159.252 |
| 1540 | 161.752 |
| 1541 | 160.752 |
| 1542 | 159.752 |
| 1543 | 162.592 |
| 1544 | 165.922 |
| 1545 | 169.152 |
| 1546 | 171.452 |
| 1547 | 170.452 |
| 1548 | 169.452 |
| 1549 | 168.452 |
| 1550 | 167.452 |
| 1551 | 166.452 |
| 1552 | 169.052 |
| 1553 | 168.052 |
| 1554 | 167.052 |
| 1555 | 170.092 |
| 1556 | 169.092 |
| 1557 | 168.092 |
| 1558 | 167.092 |
| 1559 | 169.492 |
| 1560 | 168.492 |
| 1561 | 167.492 |
| 1562 | 166.492 |
| 1563 | 170.412 |
| 1564 | 169.412 |
| 1565 | 168.412 |
| 1566 | 167.412 |
| 1567 | 166.412 |
| 1568 | 165.412 |
| 1569 | 164.412 |
| 1570 | 163.412 |
| 1571 | 162.412 |
| 1572 | 161.412 |
| 1573 | 164.102 |
| 1574 | 163.102 |
| 1575 | 162.102 |
| 1576 | 161.102 |
| 1577 | 160.102 |
| 1578 | 159.102 |
| 1579 | 158.102 |
| 1580 | 157.102 |
| 1581 | 156.102 |
| 1582 | 155.102 |
| 1583 | 155.622 |
| 1584 | 158.362 |
| 1585 | 162.182 |
| 1586 | 161.182 |
| 1587 | 160.182 |
| 1588 | 159.182 |
| 1589 | 158.182 |
| 1590 | 157.182 |
| 1591 | 156.182 |
| 1592 | 155.182 |
| 1593 | 154.182 |
| 1594 | 153.182 |
| 1595 | 156.322 |
| 1596 | 158.522 |
| 1597 | 157.522 |
| 1598 | 156.522 |
| 1599 | 155.522 |
| 1600 | 158.462 |
| 1601 | 161.892 |
| 1602 | 166.102 |
| 1603 | 170.712 |
| 1604 | 174.432 |
| 1605 | 176.682 |
| 1606 | 175.682 |
| 1607 | 176.472 |
| 1608 | 175.472 |
| 1609 | 178.362 |
| 1610 | 177.362 |
| 1611 | 176.362 |
| 1612 | 175.362 |
| 1613 | 174.362 |
| 1614 | 173.362 |
| 1615 | 172.362 |
| 1616 | 175.302 |
| 1617 | 174.302 |
| 1618 | 173.302 |
| 1619 | 172.302 |
| 1620 | 171.302 |
| 1621 | 170.302 |
| 1622 | 169.302 |
| 1623 | 168.302 |
| 1624 | 167.302 |
| 1625 | 166.302 |
| 1626 | 166.572 |
| 1627 | 165.572 |
| 1628 | 164.572 |
| 1629 | 163.572 |
| 1630 | 162.572 |
| 1631 | 161.572 |
| 1632 | 160.572 |
| 1633 | 162.972 |
| 1634 | 165.222 |
| 1635 | 164.222 |
| 1636 | 163.222 |
| 1637 | 163.332 |
| 1638 | 162.332 |
| 1639 | 161.332 |
| 1640 | 160.332 |
| 1641 | 159.332 |
| 1642 | 161.342 |
| 1643 | 161.752 |
| 1644 | 160.752 |
| 1645 | 164.182 |
| 1646 | 163.182 |
| 1647 | 163.682 |
| 1648 | 162.682 |
| 1649 | 165.622 |
| 1650 | 164.622 |
| 1651 | 163.622 |
| 1652 | 162.622 |
| 1653 | 161.622 |
| 1654 | 160.622 |
| 1655 | 159.622 |
| 1656 | 158.622 |
| 1657 | 160.292 |
| 1658 | 159.292 |
| 1659 | 159.562 |
| 1660 | 158.562 |
| 1661 | 157.562 |
| 1662 | 157.792 |
| 1663 | 156.792 |
| 1664 | 158.752 |
| 1665 | 161.982 |
| 1666 | 164.922 |
| 1667 | 163.922 |
| 1668 | 167.152 |
| 1669 | 166.152 |
| 1670 | 165.152 |
| 1671 | 167.352 |
| 1672 | 166.352 |
| 1673 | 168.512 |
| 1674 | 167.512 |
| 1675 | 170.652 |
| 1676 | 169.652 |
| 1677 | 168.652 |
| 1678 | 167.652 |
| 1679 | 166.652 |
| 1680 | 165.652 |
| 1681 | 164.652 |
| 1682 | 163.652 |
| 1683 | 162.652 |
| 1684 | 165.052 |
| 1685 | 164.052 |
| 1686 | 163.052 |
| 1687 | 165.212 |
| 1688 | 164.212 |
| 1689 | 163.212 |
| 1690 | 166.152 |
| 1691 | 165.152 |
| 1692 | 168.092 |
| 1693 | 167.092 |
| 1694 | 166.092 |
| 1695 | 169.322 |
| 1696 | 168.322 |
| 1697 | 167.322 |
| 1698 | 166.322 |
| 1699 | 166.852 |
| 1700 | 165.852 |
| 1701 | 164.852 |
| 1702 | 167.992 |
| 1703 | 170.782 |
| 1704 | 169.782 |
| 1705 | 168.782 |
| 1706 | 167.782 |
| 1707 | 166.782 |
| 1708 | 169.572 |
| 1709 | 173.292 |
| 1710 | 173.972 |
| 1711 | 179.462 |
| 1712 | 178.462 |
| 1713 | 178.872 |
| 1714 | 177.872 |
| 1715 | 176.872 |
| 1716 | 180.402 |
| 1717 | 179.402 |
| 1718 | 178.402 |
| 1719 | 177.402 |
| 1720 | 176.402 |
| 1721 | 180.032 |
| 1722 | 180.762 |
| 1723 | 184.192 |
| 1724 | 183.192 |
| 1725 | 183.632 |
| 1726 | 186.032 |
| 1727 | 185.032 |
| 1728 | 184.032 |
| 1729 | 183.032 |
| 1730 | 182.032 |
| 1731 | 181.032 |
| 1732 | 180.032 |
| 1733 | 179.032 |
| 1734 | 178.032 |
| 1735 | 177.032 |
| 1736 | 176.032 |
| 1737 | 178.972 |
| 1738 | 177.972 |
| 1739 | 180.662 |
| 1740 | 179.662 |
| 1741 | 178.662 |
| 1742 | 177.662 |
| 1743 | 176.662 |
| 1744 | 175.662 |
| 1745 | 174.662 |
| 1746 | 173.662 |
| 1747 | 172.662 |
| 1748 | 172.982 |
| 1749 | 171.982 |
| 1750 | 170.982 |
| 1751 | 172.992 |
| 1752 | 171.992 |
| 1753 | 170.992 |
| 1754 | 169.992 |
| 1755 | 170.462 |
| 1756 | 169.462 |
| 1757 | 173.092 |
| 1758 | 172.092 |
| 1759 | 171.092 |
| 1760 | 170.092 |
| 1761 | 169.092 |
| 1762 | 168.092 |
| 1763 | 167.092 |
| 1764 | 170.232 |
| 1765 | 173.272 |
| 1766 | 176.602 |
| 1767 | 175.602 |
| 1768 | 174.602 |
| 1769 | 173.602 |
| 1770 | 172.602 |
| 1771 | 171.602 |
| 1772 | 170.602 |
| 1773 | 169.602 |
| 1774 | 168.602 |
| 1775 | 171.542 |
| 1776 | 170.542 |
| 1777 | 174.562 |
| 1778 | 173.562 |
| 1779 | 172.562 |
| 1780 | 171.562 |
| 1781 | 170.562 |
| 1782 | 169.562 |
| 1783 | 172.992 |
| 1784 | 176.912 |
| 1785 | 175.912 |
| 1786 | 174.912 |
| 1787 | 173.912 |
| 1788 | 176.312 |
| 1789 | 179.102 |
| 1790 | 183.022 |
| 1791 | 182.022 |
| 1792 | 181.022 |
| 1793 | 180.022 |
| 1794 | 182.522 |
| 1795 | 184.722 |
| 1796 | 183.722 |
| 1797 | 182.722 |
| 1798 | 185.512 |
| 1799 | 184.512 |
| 1800 | 183.512 |
| 1801 | 182.512 |
| 1802 | 187.122 |
| 1803 | 186.122 |
| 1804 | 186.502 |
| 1805 | 188.852 |
| 1806 | 187.852 |
| 1807 | 186.852 |
| 1808 | 185.852 |
| 1809 | 184.852 |
| 1810 | 187.402 |
| 1811 | 189.902 |
| 1812 | 188.902 |
| 1813 | 187.902 |
| 1814 | 186.902 |
| 1815 | 190.532 |
| 1816 | 189.532 |
| 1817 | 188.532 |
| 1818 | 187.532 |
| 1819 | 186.532 |
| 1820 | 185.532 |
| 1821 | 187.832 |
| 1822 | 186.832 |
| 1823 | 185.832 |
| 1824 | 184.832 |
| 1825 | 183.832 |
| 1826 | 187.552 |
| 1827 | 189.432 |
| 1828 | 189.882 |
| 1829 | 188.882 |
| 1830 | 193.192 |
| 1831 | 195.742 |
| 1832 | 194.742 |
| 1833 | 193.742 |
| 1834 | 192.742 |
| 1835 | 191.742 |
| 1836 | 193.482 |
| 1837 | 195.542 |
| 1838 | 196.382 |
| 1839 | 195.382 |
| 1840 | 194.382 |
| 1841 | 193.382 |
| 1842 | 195.542 |
| 1843 | 194.542 |
| 1844 | 198.172 |
| 1845 | 197.172 |
| 1846 | 196.172 |
| 1847 | 199.112 |
| 1848 | 202.642 |
| 1849 | 205.872 |
| 1850 | 208.272 |
| 1851 | 207.272 |
| 1852 | 206.272 |
| 1853 | 205.272 |
| 1854 | 204.272 |
| 1855 | 203.272 |
| 1856 | 202.272 |
| 1857 | 201.272 |
| 1858 | 203.872 |
| 1859 | 202.872 |
| 1860 | 205.422 |
| 1861 | 204.422 |
| 1862 | 203.422 |
| 1863 | 204.892 |
| 1864 | 203.892 |
| 1865 | 202.892 |
| 1866 | 201.892 |
| 1867 | 200.892 |
| 1868 | 203.832 |
| 1869 | 202.832 |
| 1870 | 205.132 |
| 1871 | 208.362 |
| 1872 | 207.362 |
| 1873 | 206.362 |
| 1874 | 205.362 |
| 1875 | 204.362 |
| 1876 | 204.832 |
| 1877 | 203.832 |
| 1878 | 205.842 |
| 1879 | 207.742 |
| 1880 | 206.742 |
| 1881 | 205.742 |
| 1882 | 204.742 |
| 1883 | 209.052 |
| 1884 | 211.502 |
| 1885 | 210.502 |
| 1886 | 209.502 |
| 1887 | 211.952 |
| 1888 | 210.952 |
| 1889 | 209.952 |
| 1890 | 208.952 |
| 1891 | 207.952 |
| 1892 | 206.952 |
| 1893 | 205.952 |
| 1894 | 204.952 |
| 1895 | 203.952 |
| 1896 | 206.062 |
| 1897 | 205.062 |
| 1898 | 204.062 |
| 1899 | 206.362 |
| 1900 | 205.362 |
| 1901 | 204.362 |
| 1902 | 203.362 |
| 1903 | 202.362 |
| 1904 | 201.362 |
| 1905 | 200.362 |
| 1906 | 199.362 |
| 1907 | 198.362 |
| 1908 | 197.362 |
| 1909 | 196.362 |
| 1910 | 198.422 |
| 1911 | 201.212 |
| 1912 | 200.212 |
| 1913 | 199.212 |
| 1914 | 198.212 |
| 1915 | 197.212 |
| 1916 | 196.212 |
| 1917 | 196.432 |
| 1918 | 195.432 |
| 1919 | 194.432 |
| 1920 | 198.352 |
| 1921 | 197.352 |
| 1922 | 196.352 |
| 1923 | 199.982 |
| 1924 | 198.982 |
| 1925 | 197.982 |
| 1926 | 200.532 |
| 1927 | 199.532 |
| 1928 | 198.532 |
| 1929 | 197.532 |
| 1930 | 196.532 |
| 1931 | 195.532 |
| 1932 | 197.692 |
| 1933 | 196.692 |
| 1934 | 195.692 |
| 1935 | 194.692 |
| 1936 | 193.692 |
| 1937 | 196.632 |
| 1938 | 197.452 |
| 1939 | 196.452 |
| 1940 | 195.452 |
| 1941 | 194.452 |
| 1942 | 193.452 |
| 1943 | 192.452 |
| 1944 | 195.052 |
| 1945 | 198.772 |
| 1946 | 197.772 |
| 1947 | 198.402 |
| 1948 | 197.402 |
| 1949 | 196.402 |
| 1950 | 195.402 |
| 1951 | 199.222 |
| 1952 | 198.222 |
| 1953 | 197.222 |
| 1954 | 196.222 |
| 1955 | 198.872 |
| 1956 | 197.872 |
| 1957 | 196.872 |
| 1958 | 195.872 |
| 1959 | 194.872 |
| 1960 | 193.872 |
| 1961 | 192.872 |
| 1962 | 191.872 |
| 1963 | 190.872 |
| 1964 | 189.872 |
| 1965 | 188.872 |
| 1966 | 187.872 |
| 1967 | 189.672 |
| 1968 | 188.672 |
| 1969 | 187.672 |
| 1970 | 186.672 |
| 1971 | 185.672 |
| 1972 | 184.672 |
| 1973 | 183.672 |
| 1974 | 182.672 |
| 1975 | 181.672 |
| 1976 | 182.192 |
| 1977 | 185.332 |
| 1978 | 184.332 |
| 1979 | 183.332 |
| 1980 | 182.332 |
| 1981 | 181.332 |
| 1982 | 180.332 |
| 1983 | 182.582 |
| 1984 | 181.582 |
| 1985 | 180.582 |
| 1986 | 179.582 |
| 1987 | 181.692 |
| 1988 | 180.692 |
| 1989 | 181.042 |
| 1990 | 180.042 |
| 1991 | 179.042 |
| 1992 | 178.042 |
| 1993 | 177.042 |
| 1994 | 176.042 |
| 1995 | 175.042 |
| 1996 | 177.882 |
| 1997 | 176.882 |
| 1998 | 175.882 |
| 1999 | 174.882 |
| 2000 | 173.882 |
| 2001 | 172.882 |
| 2002 | 171.882 |
| 2003 | 170.882 |
| 2004 | 169.882 |
| 2005 | 168.882 |
| 2006 | 172.112 |
| 2007 | 171.112 |
| 2008 | 170.112 |
| 2009 | 169.112 |
| 2010 | 168.112 |
| 2011 | 167.112 |
| 2012 | 166.112 |
| 2013 | 169.052 |
| 2014 | 168.052 |
| 2015 | 167.052 |
| 2016 | 166.052 |
| 2017 | 169.192 |
| 2018 | 168.192 |
| 2019 | 167.192 |
| 2020 | 166.192 |
| 2021 | 165.192 |
| 2022 | 168.822 |
| 2023 | 167.822 |
| 2024 | 166.822 |
| 2025 | 165.822 |
| 2026 | 164.822 |
| 2027 | 163.822 |
| 2028 | 162.822 |
| 2029 | 161.822 |
| 2030 | 160.822 |
| 2031 | 159.822 |
| 2032 | 158.822 |
| 2033 | 161.712 |
| 2034 | 160.712 |
| 2035 | 159.712 |
| 2036 | 158.712 |
| 2037 | 157.712 |
| 2038 | 158.132 |
| 2039 | 157.132 |
| 2040 | 156.132 |
| 2041 | 158.092 |
| 2042 | 160.012 |
| 2043 | 159.012 |
| 2044 | 158.012 |
| 2045 | 157.012 |
| 2046 | 156.012 |
| 2047 | 155.012 |
| 2048 | 154.012 |
| 2049 | 153.012 |
| 2050 | 152.012 |
| 2051 | 151.012 |
| 2052 | 153.662 |
| 2053 | 157.582 |
| 2054 | 156.582 |
| 2055 | 158.382 |
| 2056 | 157.382 |
| 2057 | 156.382 |
| 2058 | 158.932 |
| 2059 | 159.202 |
| 2060 | 158.202 |
| 2061 | 157.202 |
| 2062 | 156.202 |
| 2063 | 155.202 |
| 2064 | 154.202 |
| 2065 | 153.202 |
| 2066 | 155.502 |
| 2067 | 154.502 |
| 2068 | 156.952 |
| 2069 | 158.662 |
| 2070 | 161.352 |
| 2071 | 162.332 |
| 2072 | 161.332 |
| 2073 | 160.332 |
| 2074 | 159.332 |
| 2075 | 162.072 |
| 2076 | 161.072 |
| 2077 | 162.322 |
| 2078 | 161.322 |
| 2079 | 166.222 |
| 2080 | 165.222 |
| 2081 | 166.262 |
| 2082 | 165.262 |
| 2083 | 165.902 |
| 2084 | 164.902 |
| 2085 | 163.902 |
| 2086 | 162.902 |
| 2087 | 164.962 |
| 2088 | 163.962 |
| 2089 | 166.072 |
| 2090 | 168.322 |
| 2091 | 169.572 |
| 2092 | 171.922 |
| 2093 | 172.892 |
| 2094 | 171.892 |
| 2095 | 175.912 |
| 2096 | 174.912 |
| 2097 | 179.322 |
| 2098 | 178.322 |
| 2099 | 177.322 |
| 2100 | 176.322 |
| 2101 | 178.922 |
| 2102 | 180.702 |
| 2103 | 179.702 |
| 2104 | 178.702 |
| 2105 | 181.152 |
| 2106 | 180.152 |
| 2107 | 183.292 |
| 2108 | 182.292 |
| 2109 | 181.292 |
| 2110 | 181.822 |
| 2111 | 180.822 |
| 2112 | 183.762 |
| 2113 | 182.762 |
| 2114 | 181.762 |
| 2115 | 180.762 |
| 2116 | 179.762 |
| 2117 | 178.762 |
| 2118 | 177.762 |
| 2119 | 176.762 |
| 2120 | 175.762 |
| 2121 | 174.762 |
| 2122 | 176.392 |
| 2123 | 177.922 |
| 2124 | 176.922 |
| 2125 | 179.172 |
| 2126 | 179.852 |
| 2127 | 178.852 |
| 2128 | 177.852 |
| 2129 | 182.752 |
| 2130 | 183.812 |
| 2131 | 182.812 |
| 2132 | 183.392 |
| 2133 | 182.392 |
| 2134 | 181.392 |
| 2135 | 184.922 |
| 2136 | 183.922 |
| 2137 | 184.702 |
| 2138 | 187.052 |
| 2139 | 190.282 |
| 2140 | 189.282 |
| 2141 | 188.282 |
| 2142 | 187.282 |
| 2143 | 186.282 |
| 2144 | 185.282 |
| 2145 | 184.282 |
| 2146 | 183.282 |
| 2147 | 182.282 |
| 2148 | 181.282 |
| 2149 | 184.422 |
| 2150 | 183.422 |
| 2151 | 184.732 |
| 2152 | 186.692 |
| 2153 | 185.692 |
| 2154 | 184.692 |
| 2155 | 183.692 |
| 2156 | 186.142 |
| 2157 | 185.142 |
| 2158 | 186.492 |
| 2159 | 188.272 |
| 2160 | 187.272 |
| 2161 | 186.272 |
| 2162 | 185.272 |
| 2163 | 190.952 |
| 2164 | 189.952 |
| 2165 | 202.202 |
| 2166 | 201.202 |
| 2167 | 200.202 |
| 2168 | 199.202 |
| 2169 | 203.902 |
| 2170 | 202.902 |
| 2171 | 201.902 |
| 2172 | 200.902 |
| 2173 | 203.352 |
| 2174 | 207.562 |
| 2175 | 206.562 |
| 2176 | 205.562 |
| 2177 | 204.562 |
| 2178 | 203.562 |
| 2179 | 202.562 |
| 2180 | 204.912 |
| 2181 | 203.912 |
| 2182 | 202.912 |
| 2183 | 201.912 |
| 2184 | 200.912 |
| 2185 | 199.912 |
| 2186 | 198.912 |
| 2187 | 197.912 |
| 2188 | 199.502 |
| 2189 | 198.502 |
| 2190 | 197.502 |
| 2191 | 196.502 |
| 2192 | 195.502 |
| 2193 | 194.502 |
| 2194 | 193.502 |
| 2195 | 192.502 |
| 2196 | 191.502 |
| 2197 | 190.502 |
| 2198 | 189.502 |
| 2199 | 188.502 |
| 2200 | 187.502 |
| 2201 | 190.242 |
| 2202 | 192.352 |
| 2203 | 193.512 |
| 2204 | 192.512 |
| 2205 | 197.022 |
| 2206 | 196.022 |
| 2207 | 200.332 |
| 2208 | 199.332 |
| 2209 | 198.332 |
| 2210 | 197.332 |
| 2211 | 196.332 |
| 2212 | 195.332 |
| 2213 | 198.222 |
| 2214 | 197.222 |
| 2215 | 196.222 |
| 2216 | 199.262 |
| 2217 | 198.262 |
| 2218 | 197.262 |
| 2219 | 196.262 |
| 2220 | 195.262 |
| 2221 | 197.712 |
| 2222 | 199.362 |
| 2223 | 198.362 |
| 2224 | 197.362 |
| 2225 | 196.362 |
| 2226 | 195.362 |
| 2227 | 196.422 |
| 2228 | 195.422 |
| 2229 | 194.422 |
| 2230 | 198.542 |
| 2231 | 197.542 |
| 2232 | 196.542 |
| 2233 | 195.542 |
| 2234 | 194.542 |
| 2235 | 193.542 |
| 2236 | 192.542 |
| 2237 | 191.542 |
| 2238 | 190.542 |
| 2239 | 191.932 |
| 2240 | 190.932 |
| 2241 | 189.932 |
| 2242 | 188.932 |
| 2243 | 187.932 |
| 2244 | 186.932 |
| 2245 | 185.932 |
| 2246 | 184.932 |
| 2247 | 183.932 |
| 2248 | 182.932 |
| 2249 | 181.932 |
| 2250 | 180.932 |
| 2251 | 179.932 |
| 2252 | 178.932 |
| 2253 | 181.092 |
| 2254 | 180.092 |
| 2255 | 179.092 |
| 2256 | 178.092 |
| 2257 | 178.742 |
| 2258 | 179.862 |
| 2259 | 180.632 |
| 2260 | 182.182 |
| 2261 | 181.182 |
| 2262 | 180.182 |
| 2263 | 182.102 |
| 2264 | 182.752 |
| 2265 | 183.832 |
| 2266 | 185.362 |
| 2267 | 186.772 |
| 2268 | 185.772 |
| 2269 | 184.772 |
| 2270 | 185.502 |
| 2271 | 187.462 |
| 2272 | 186.462 |
| 2273 | 188.912 |
| 2274 | 189.972 |
| 2275 | 190.082 |
| 2276 | 191.942 |
| 2277 | 193.952 |
| 2278 | 192.952 |
| 2279 | 193.322 |
| 2280 | 195.572 |
| 2281 | 197.632 |
| 2282 | 197.772 |
| 2283 | 198.772 |
| 2284 | 197.772 |
| 2285 | 199.022 |
| 2286 | 198.022 |
| 2287 | 198.192 |
| 2288 | 198.382 |
| 2289 | 197.382 |
| 2290 | 199.732 |
| 2291 | 198.732 |
| 2292 | 197.732 |
| 2293 | 198.612 |
| 2294 | 197.612 |
| 2295 | 196.612 |
| 2296 | 195.612 |
| 2297 | 194.612 |
| 2298 | 196.572 |
| 2299 | 195.572 |
| 2300 | 194.572 |
| 2301 | 193.572 |
| 2302 | 192.572 |
| 2303 | 191.572 |
| 2304 | 192.962 |
| 2305 | 191.962 |
| 2306 | 190.962 |
| 2307 | 189.962 |
| 2308 | 188.962 |
| 2309 | 190.212 |
| 2310 | 189.212 |
| 2311 | 192.152 |
| 2312 | 193.582 |
| 2313 | 195.132 |
| 2314 | 196.662 |
| 2315 | 195.662 |
| 2316 | 196.052 |
| 2317 | 197.152 |
| 2318 | 198.072 |
| 2319 | 197.072 |
| 2320 | 196.072 |
| 2321 | 195.072 |
| 2322 | 194.072 |
| 2323 | 193.072 |
| 2324 | 192.072 |
| 2325 | 191.072 |
| 2326 | 190.072 |
| 2327 | 189.072 |
| 2328 | 188.072 |
| 2329 | 190.762 |
| 2330 | 189.762 |
| 2331 | 190.152 |
| 2332 | 190.672 |
| 2333 | 189.672 |
| 2334 | 188.672 |
| 2335 | 187.672 |
| 2336 | 189.342 |
| 2337 | 188.342 |
| 2338 | 188.562 |
| 2339 | 187.562 |
| 2340 | 186.562 |
| 2341 | 187.792 |
| 2342 | 186.792 |
| 2343 | 185.792 |
| 2344 | 184.792 |
| 2345 | 183.792 |
| 2346 | 182.792 |
| 2347 | 183.622 |
| 2348 | 182.622 |
| 2349 | 181.622 |
| 2350 | 182.172 |
| 2351 | 182.952 |
| 2352 | 181.952 |
| 2353 | 180.952 |
| 2354 | 179.952 |
| 2355 | 178.952 |
| 2356 | 179.352 |
| 2357 | 178.352 |
| 2358 | 177.352 |
| 2359 | 179.312 |
| 2360 | 178.312 |
| 2361 | 179.372 |
| 2362 | 178.372 |
| 2363 | 177.372 |
| 2364 | 176.372 |
| 2365 | 178.062 |
| 2366 | 179.372 |
| 2367 | 178.372 |
| 2368 | 180.622 |
| 2369 | 183.072 |
| 2370 | 183.422 |
| 2371 | 185.142 |
| 2372 | 185.412 |
| 2373 | 184.412 |
| 2374 | 185.882 |
| 2375 | 184.882 |
| 2376 | 186.992 |
| 2377 | 185.992 |
| 2378 | 184.992 |
| 2379 | 183.992 |
| 2380 | 182.992 |
| 2381 | 183.462 |
| 2382 | 182.462 |
| 2383 | 181.462 |
| 2384 | 181.672 |
| 2385 | 182.282 |
| 2386 | 182.972 |
| 2387 | 184.832 |
| 2388 | 185.452 |
| 2389 | 186.942 |
| 2390 | 189.292 |
| 2391 | 188.292 |
| 2392 | 187.292 |
| 2393 | 186.292 |
| 2394 | 185.292 |
| 2395 | 185.972 |
| 2396 | 186.972 |
| 2397 | 185.972 |
| 2398 | 184.972 |
| 2399 | 187.222 |
| 2400 | 186.222 |
| 2401 | 187.022 |
| 2402 | 186.022 |
| 2403 | 185.022 |
| 2404 | 185.982 |
| 2405 | 184.982 |
| 2406 | 183.982 |
| 2407 | 182.982 |
| 2408 | 185.042 |
| 2409 | 184.042 |
| 2410 | 183.042 |
| 2411 | 184.532 |
| 2412 | 183.532 |
| 2413 | 182.532 |
| 2414 | 183.232 |
| 2415 | 184.642 |
| 2416 | 183.642 |
| 2417 | 182.642 |
| 2418 | 183.382 |
| 2419 | 182.382 |
| 2420 | 184.342 |
| 2421 | 183.342 |
| 2422 | 184.382 |
| 2423 | 183.382 |
| 2424 | 184.612 |
| 2425 | 183.612 |
| 2426 | 184.902 |
| 2427 | 183.902 |
| 2428 | 182.902 |
| 2429 | 183.902 |
| 2430 | 182.902 |
| 2431 | 181.902 |
| 2432 | 182.622 |
| 2433 | 181.622 |
| 2434 | 180.622 |
| 2435 | 179.622 |
| 2436 | 178.622 |
| 2437 | 177.622 |
| 2438 | 176.622 |
| 2439 | 175.622 |
| 2440 | 174.622 |
| 2441 | 173.622 |
| 2442 | 175.272 |
| 2443 | 174.272 |
| 2444 | 173.272 |
| 2445 | 172.272 |
| 2446 | 174.672 |
| 2447 | 176.302 |
| 2448 | 177.032 |
| 2449 | 176.032 |
| 2450 | 177.422 |
| 2451 | 176.422 |
| 2452 | 175.422 |
| 2453 | 176.272 |
| 2454 | 176.562 |
| 2455 | 175.562 |
| 2456 | 176.072 |
| 2457 | 177.602 |
| 2458 | 176.602 |
| 2459 | 175.602 |
| 2460 | 175.952 |
| 2461 | 176.802 |
| 2462 | 178.192 |
| 2463 | 177.192 |
| 2464 | 176.192 |
| 2465 | 176.852 |
| 2466 | 178.282 |
| 2467 | 179.282 |
| 2468 | 178.282 |
| 2469 | 177.282 |
| 2470 | 176.282 |
| 2471 | 177.972 |